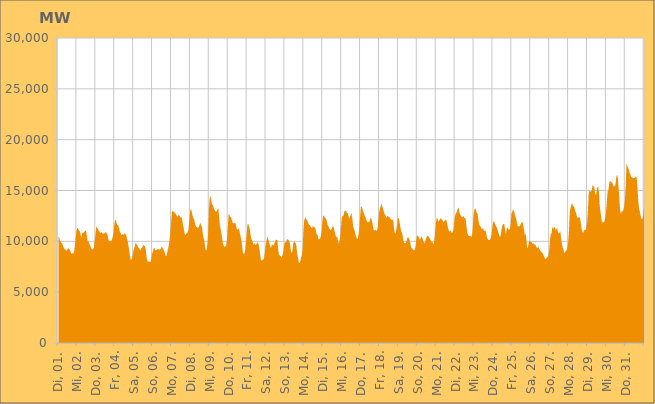
| Category | Series 0 |
|---|---|
|  Di, 01.  | 10445.555 |
|  Di, 01.  | 10419.191 |
|  Di, 01.  | 10097.247 |
|  Di, 01.  | 9958.587 |
|  Di, 01.  | 9844.854 |
|  Di, 01.  | 9770.898 |
|  Di, 01.  | 9508.113 |
|  Di, 01.  | 9325.802 |
|  Di, 01.  | 9215.358 |
|  Di, 01.  | 9183.292 |
|  Di, 01.  | 9062.21 |
|  Di, 01.  | 9200.198 |
|  Di, 01.  | 9219.905 |
|  Di, 01.  | 9341.486 |
|  Di, 01.  | 9201.362 |
|  Di, 01.  | 9060.962 |
|  Di, 01.  | 8852.814 |
|  Mi, 02.  | 8771.152 |
|  Mi, 02.  | 8826.07 |
|  Mi, 02.  | 8798.517 |
|  Mi, 02.  | 9039.4 |
|  Mi, 02.  | 9613.556 |
|  Mi, 02.  | 10374.406 |
|  Mi, 02.  | 11110.4 |
|  Mi, 02.  | 11357.895 |
|  Mi, 02.  | 11228.03 |
|  Mi, 02.  | 11088.038 |
|  Mi, 02.  | 11022.126 |
|  Mi, 02.  | 10733.58 |
|  Mi, 02.  | 10320.139 |
|  Mi, 02.  | 10777.185 |
|  Mi, 02.  | 10840.873 |
|  Mi, 02.  | 10858.001 |
|  Mi, 02.  | 10942.536 |
|  Mi, 02.  | 11053.273 |
|  Mi, 02.  | 11038.08 |
|  Mi, 02.  | 10603.086 |
|  Mi, 02.  | 9985.079 |
|  Mi, 02.  | 10029.684 |
|  Mi, 02.  | 9805.997 |
|  Mi, 02.  | 9645.54 |
|  Do, 03.  | 9463.206 |
|  Do, 03.  | 9246.563 |
|  Do, 03.  | 9196.385 |
|  Do, 03.  | 9236.031 |
|  Do, 03.  | 9390.222 |
|  Do, 03.  | 10028.074 |
|  Do, 03.  | 10663.041 |
|  Do, 03.  | 11423.543 |
|  Do, 03.  | 11342.75 |
|  Do, 03.  | 11226.537 |
|  Do, 03.  | 11043.154 |
|  Do, 03.  | 10981.808 |
|  Do, 03.  | 10848.605 |
|  Do, 03.  | 10858.742 |
|  Do, 03.  | 10906.88 |
|  Do, 03.  | 10753.203 |
|  Do, 03.  | 10773.815 |
|  Do, 03.  | 10733.892 |
|  Do, 03.  | 10811.203 |
|  Do, 03.  | 10944.98 |
|  Do, 03.  | 10813.566 |
|  Do, 03.  | 10718.458 |
|  Do, 03.  | 10353.268 |
|  Do, 03.  | 10026.153 |
|  Fr, 04.  | 10005.673 |
|  Fr, 04.  | 10040.819 |
|  Fr, 04.  | 10026.183 |
|  Fr, 04.  | 10138.438 |
|  Fr, 04.  | 10494.255 |
|  Fr, 04.  | 10883.877 |
|  Fr, 04.  | 11672.149 |
|  Fr, 04.  | 12050.847 |
|  Fr, 04.  | 12126.928 |
|  Fr, 04.  | 11753.707 |
|  Fr, 04.  | 11578.634 |
|  Fr, 04.  | 11565.523 |
|  Fr, 04.  | 11278.002 |
|  Fr, 04.  | 10945.739 |
|  Fr, 04.  | 10810.986 |
|  Fr, 04.  | 10598.176 |
|  Fr, 04.  | 10696.293 |
|  Fr, 04.  | 10681.751 |
|  Fr, 04.  | 10632.904 |
|  Fr, 04.  | 10795.002 |
|  Fr, 04.  | 10748.967 |
|  Fr, 04.  | 10632.363 |
|  Fr, 04.  | 10275.996 |
|  Fr, 04.  | 9980.591 |
|  Sa, 05.  | 9514.506 |
|  Sa, 05.  | 9021.876 |
|  Sa, 05.  | 8442.661 |
|  Sa, 05.  | 8174.343 |
|  Sa, 05.  | 8248.017 |
|  Sa, 05.  | 8510.015 |
|  Sa, 05.  | 8963.122 |
|  Sa, 05.  | 9272.572 |
|  Sa, 05.  | 9511.825 |
|  Sa, 05.  | 9886.77 |
|  Sa, 05.  | 9743.409 |
|  Sa, 05.  | 9620.666 |
|  Sa, 05.  | 9459.004 |
|  Sa, 05.  | 9334.704 |
|  Sa, 05.  | 9241.436 |
|  Sa, 05.  | 9075.775 |
|  Sa, 05.  | 9298.42 |
|  Sa, 05.  | 9354.086 |
|  Sa, 05.  | 9531.195 |
|  Sa, 05.  | 9655.398 |
|  Sa, 05.  | 9579.519 |
|  Sa, 05.  | 9476.483 |
|  Sa, 05.  | 9142.633 |
|  Sa, 05.  | 8419.96 |
|  So, 06.  | 7963.99 |
|  So, 06.  | 8060.899 |
|  So, 06.  | 7995.862 |
|  So, 06.  | 7970.158 |
|  So, 06.  | 7950.514 |
|  So, 06.  | 8342.362 |
|  So, 06.  | 8798.902 |
|  So, 06.  | 9030.661 |
|  So, 06.  | 9360.931 |
|  So, 06.  | 9336.352 |
|  So, 06.  | 9083.783 |
|  So, 06.  | 9141.129 |
|  So, 06.  | 9172.689 |
|  So, 06.  | 9251.171 |
|  So, 06.  | 9201.761 |
|  So, 06.  | 9203.3 |
|  So, 06.  | 9191.451 |
|  So, 06.  | 9278.999 |
|  So, 06.  | 9478.748 |
|  So, 06.  | 9387.526 |
|  So, 06.  | 9182.743 |
|  So, 06.  | 9090.256 |
|  So, 06.  | 8907.548 |
|  So, 06.  | 8584.94 |
|  Mo, 07.  | 8533.166 |
|  Mo, 07.  | 8889.502 |
|  Mo, 07.  | 9207.967 |
|  Mo, 07.  | 9571.606 |
|  Mo, 07.  | 10072.7 |
|  Mo, 07.  | 10750.087 |
|  Mo, 07.  | 11796.692 |
|  Mo, 07.  | 12857.751 |
|  Mo, 07.  | 12974.46 |
|  Mo, 07.  | 12963.93 |
|  Mo, 07.  | 12845.943 |
|  Mo, 07.  | 12816.254 |
|  Mo, 07.  | 12669.865 |
|  Mo, 07.  | 12559.615 |
|  Mo, 07.  | 12384.745 |
|  Mo, 07.  | 12533.211 |
|  Mo, 07.  | 12596.078 |
|  Mo, 07.  | 12482.191 |
|  Mo, 07.  | 12336.333 |
|  Mo, 07.  | 12390.351 |
|  Mo, 07.  | 12177.749 |
|  Mo, 07.  | 11707.152 |
|  Mo, 07.  | 11308.112 |
|  Mo, 07.  | 10806.887 |
|  Di, 08.  | 10593.928 |
|  Di, 08.  | 10710.138 |
|  Di, 08.  | 10775.645 |
|  Di, 08.  | 10894.459 |
|  Di, 08.  | 11131.542 |
|  Di, 08.  | 11830.049 |
|  Di, 08.  | 12882.979 |
|  Di, 08.  | 13219.369 |
|  Di, 08.  | 12991.055 |
|  Di, 08.  | 12621.662 |
|  Di, 08.  | 12329.587 |
|  Di, 08.  | 12209.612 |
|  Di, 08.  | 11885.83 |
|  Di, 08.  | 11594.195 |
|  Di, 08.  | 11405.807 |
|  Di, 08.  | 11399.331 |
|  Di, 08.  | 11309.371 |
|  Di, 08.  | 11386.213 |
|  Di, 08.  | 11590.257 |
|  Di, 08.  | 11841.671 |
|  Di, 08.  | 11642.917 |
|  Di, 08.  | 11434.284 |
|  Di, 08.  | 10893.425 |
|  Di, 08.  | 10397.928 |
|  Mi, 09.  | 10209.229 |
|  Mi, 09.  | 9545.648 |
|  Mi, 09.  | 9134.546 |
|  Mi, 09.  | 9136.57 |
|  Mi, 09.  | 9666.557 |
|  Mi, 09.  | 10764.98 |
|  Mi, 09.  | 13186.478 |
|  Mi, 09.  | 14120.65 |
|  Mi, 09.  | 14536.935 |
|  Mi, 09.  | 14032.447 |
|  Mi, 09.  | 13622.536 |
|  Mi, 09.  | 13591.791 |
|  Mi, 09.  | 13324.217 |
|  Mi, 09.  | 13116.796 |
|  Mi, 09.  | 12984.143 |
|  Mi, 09.  | 12901.335 |
|  Mi, 09.  | 12973.562 |
|  Mi, 09.  | 13162.781 |
|  Mi, 09.  | 13260.028 |
|  Mi, 09.  | 12387.385 |
|  Mi, 09.  | 11547.914 |
|  Mi, 09.  | 11176.04 |
|  Mi, 09.  | 10698.175 |
|  Mi, 09.  | 10263.756 |
|  Do, 10.  | 9676.162 |
|  Do, 10.  | 9559.6 |
|  Do, 10.  | 9451.004 |
|  Do, 10.  | 9528.954 |
|  Do, 10.  | 9558.523 |
|  Do, 10.  | 10216.979 |
|  Do, 10.  | 11376.004 |
|  Do, 10.  | 12633.762 |
|  Do, 10.  | 12635.733 |
|  Do, 10.  | 12412.581 |
|  Do, 10.  | 12391.956 |
|  Do, 10.  | 12134.114 |
|  Do, 10.  | 11845.056 |
|  Do, 10.  | 11744.92 |
|  Do, 10.  | 11823.355 |
|  Do, 10.  | 11747.993 |
|  Do, 10.  | 11775.761 |
|  Do, 10.  | 11350.507 |
|  Do, 10.  | 11090.281 |
|  Do, 10.  | 11195.756 |
|  Do, 10.  | 11279.297 |
|  Do, 10.  | 10911.545 |
|  Do, 10.  | 10578.303 |
|  Do, 10.  | 10220.414 |
|  Fr, 11.  | 9765.48 |
|  Fr, 11.  | 8951.537 |
|  Fr, 11.  | 8738.125 |
|  Fr, 11.  | 8785.089 |
|  Fr, 11.  | 9031.588 |
|  Fr, 11.  | 9795.053 |
|  Fr, 11.  | 10784.602 |
|  Fr, 11.  | 11665.44 |
|  Fr, 11.  | 11747.85 |
|  Fr, 11.  | 11435.452 |
|  Fr, 11.  | 11155.981 |
|  Fr, 11.  | 10534.767 |
|  Fr, 11.  | 10224.218 |
|  Fr, 11.  | 10048.105 |
|  Fr, 11.  | 9817.822 |
|  Fr, 11.  | 9626.965 |
|  Fr, 11.  | 9837.764 |
|  Fr, 11.  | 9648.15 |
|  Fr, 11.  | 9685.797 |
|  Fr, 11.  | 9805.668 |
|  Fr, 11.  | 9923.382 |
|  Fr, 11.  | 9727.097 |
|  Fr, 11.  | 9274.501 |
|  Fr, 11.  | 8784.315 |
|  Sa, 12.  | 8202.789 |
|  Sa, 12.  | 8080.126 |
|  Sa, 12.  | 8180.09 |
|  Sa, 12.  | 8163.664 |
|  Sa, 12.  | 8363.963 |
|  Sa, 12.  | 8933.969 |
|  Sa, 12.  | 9585.958 |
|  Sa, 12.  | 9989.784 |
|  Sa, 12.  | 10469.398 |
|  Sa, 12.  | 10318.208 |
|  Sa, 12.  | 10039.283 |
|  Sa, 12.  | 9745.637 |
|  Sa, 12.  | 9419.608 |
|  Sa, 12.  | 9394.065 |
|  Sa, 12.  | 9716.837 |
|  Sa, 12.  | 9653.962 |
|  Sa, 12.  | 9564.99 |
|  Sa, 12.  | 9756.094 |
|  Sa, 12.  | 9985.423 |
|  Sa, 12.  | 10155.288 |
|  Sa, 12.  | 10151.18 |
|  Sa, 12.  | 10068.063 |
|  Sa, 12.  | 9186.608 |
|  Sa, 12.  | 8673.23 |
|  So, 13.  | 8580.023 |
|  So, 13.  | 8529.103 |
|  So, 13.  | 8415.116 |
|  So, 13.  | 8560.362 |
|  So, 13.  | 8761.938 |
|  So, 13.  | 9279.886 |
|  So, 13.  | 9848.621 |
|  So, 13.  | 9911.59 |
|  So, 13.  | 9895.906 |
|  So, 13.  | 10171.776 |
|  So, 13.  | 10217.708 |
|  So, 13.  | 10130.983 |
|  So, 13.  | 9984.692 |
|  So, 13.  | 9746.831 |
|  So, 13.  | 9073.384 |
|  So, 13.  | 8825.252 |
|  So, 13.  | 9050.027 |
|  So, 13.  | 9723.191 |
|  So, 13.  | 9957.204 |
|  So, 13.  | 9931.586 |
|  So, 13.  | 9871.606 |
|  So, 13.  | 9575.368 |
|  So, 13.  | 8790.546 |
|  So, 13.  | 8435.192 |
|  Mo, 14.  | 7947.737 |
|  Mo, 14.  | 7822.809 |
|  Mo, 14.  | 8055.755 |
|  Mo, 14.  | 8420.154 |
|  Mo, 14.  | 8628.184 |
|  Mo, 14.  | 9361.329 |
|  Mo, 14.  | 11045.785 |
|  Mo, 14.  | 12063.801 |
|  Mo, 14.  | 12252.933 |
|  Mo, 14.  | 12348.455 |
|  Mo, 14.  | 12128.814 |
|  Mo, 14.  | 12022.373 |
|  Mo, 14.  | 11815.038 |
|  Mo, 14.  | 11618.956 |
|  Mo, 14.  | 11618.37 |
|  Mo, 14.  | 11463.142 |
|  Mo, 14.  | 11347.734 |
|  Mo, 14.  | 11315.684 |
|  Mo, 14.  | 11526.563 |
|  Mo, 14.  | 11392.12 |
|  Mo, 14.  | 11391.354 |
|  Mo, 14.  | 11328.287 |
|  Mo, 14.  | 10966.417 |
|  Mo, 14.  | 10632.166 |
|  Di, 15.  | 10642.651 |
|  Di, 15.  | 10163.73 |
|  Di, 15.  | 10227.957 |
|  Di, 15.  | 10275.395 |
|  Di, 15.  | 10450.979 |
|  Di, 15.  | 10898.814 |
|  Di, 15.  | 11913.05 |
|  Di, 15.  | 12521.305 |
|  Di, 15.  | 12495.394 |
|  Di, 15.  | 12354.789 |
|  Di, 15.  | 12274.967 |
|  Di, 15.  | 12151.17 |
|  Di, 15.  | 11863.305 |
|  Di, 15.  | 11534.137 |
|  Di, 15.  | 11435.996 |
|  Di, 15.  | 11240.502 |
|  Di, 15.  | 11111.29 |
|  Di, 15.  | 11133.704 |
|  Di, 15.  | 11273.614 |
|  Di, 15.  | 11456.774 |
|  Di, 15.  | 11429.287 |
|  Di, 15.  | 11182.272 |
|  Di, 15.  | 10801.253 |
|  Di, 15.  | 10515.676 |
|  Mi, 16.  | 10360.821 |
|  Mi, 16.  | 10478.339 |
|  Mi, 16.  | 10000.419 |
|  Mi, 16.  | 9772.426 |
|  Mi, 16.  | 10159.462 |
|  Mi, 16.  | 10763.949 |
|  Mi, 16.  | 11776.305 |
|  Mi, 16.  | 12505.466 |
|  Mi, 16.  | 12438.467 |
|  Mi, 16.  | 12579.94 |
|  Mi, 16.  | 12968.605 |
|  Mi, 16.  | 12956.017 |
|  Mi, 16.  | 13045.247 |
|  Mi, 16.  | 12796.004 |
|  Mi, 16.  | 12800.798 |
|  Mi, 16.  | 12499.161 |
|  Mi, 16.  | 12237.263 |
|  Mi, 16.  | 12357.345 |
|  Mi, 16.  | 12590.866 |
|  Mi, 16.  | 12788.217 |
|  Mi, 16.  | 12282.956 |
|  Mi, 16.  | 11565.071 |
|  Mi, 16.  | 11244.101 |
|  Mi, 16.  | 11050.836 |
|  Do, 17.  | 10728.593 |
|  Do, 17.  | 10408.176 |
|  Do, 17.  | 10259.666 |
|  Do, 17.  | 10250.485 |
|  Do, 17.  | 10718.293 |
|  Do, 17.  | 11361.653 |
|  Do, 17.  | 12504.733 |
|  Do, 17.  | 13497.029 |
|  Do, 17.  | 13377.784 |
|  Do, 17.  | 13158.784 |
|  Do, 17.  | 12899.266 |
|  Do, 17.  | 12690.479 |
|  Do, 17.  | 12450.276 |
|  Do, 17.  | 12325.686 |
|  Do, 17.  | 12050.218 |
|  Do, 17.  | 11889.208 |
|  Do, 17.  | 11865.422 |
|  Do, 17.  | 11911.695 |
|  Do, 17.  | 11970.007 |
|  Do, 17.  | 12256.806 |
|  Do, 17.  | 12277.804 |
|  Do, 17.  | 11995.462 |
|  Do, 17.  | 11564.019 |
|  Do, 17.  | 11095.498 |
|  Fr, 18.  | 11065.898 |
|  Fr, 18.  | 11091.945 |
|  Fr, 18.  | 11153.475 |
|  Fr, 18.  | 10997.17 |
|  Fr, 18.  | 11236.366 |
|  Fr, 18.  | 11953.484 |
|  Fr, 18.  | 12789.681 |
|  Fr, 18.  | 13236.253 |
|  Fr, 18.  | 13429.299 |
|  Fr, 18.  | 13733.035 |
|  Fr, 18.  | 13441.035 |
|  Fr, 18.  | 13220.919 |
|  Fr, 18.  | 12916.824 |
|  Fr, 18.  | 12675.31 |
|  Fr, 18.  | 12591.215 |
|  Fr, 18.  | 12328.804 |
|  Fr, 18.  | 12382.568 |
|  Fr, 18.  | 12539.702 |
|  Fr, 18.  | 12406.733 |
|  Fr, 18.  | 12397.016 |
|  Fr, 18.  | 12308.139 |
|  Fr, 18.  | 12164.783 |
|  Fr, 18.  | 12091.921 |
|  Fr, 18.  | 12154.313 |
|  Sa, 19.  | 12035.187 |
|  Sa, 19.  | 11284.065 |
|  Sa, 19.  | 10768.211 |
|  Sa, 19.  | 10791.193 |
|  Sa, 19.  | 11210.825 |
|  Sa, 19.  | 11740.285 |
|  Sa, 19.  | 12306.179 |
|  Sa, 19.  | 12279.634 |
|  Sa, 19.  | 11896.305 |
|  Sa, 19.  | 11401.208 |
|  Sa, 19.  | 11018.473 |
|  Sa, 19.  | 10869.456 |
|  Sa, 19.  | 10478.5 |
|  Sa, 19.  | 10044.587 |
|  Sa, 19.  | 9810.825 |
|  Sa, 19.  | 9806.027 |
|  Sa, 19.  | 9831.973 |
|  Sa, 19.  | 10064.115 |
|  Sa, 19.  | 10383.45 |
|  Sa, 19.  | 10403.461 |
|  Sa, 19.  | 10248.074 |
|  Sa, 19.  | 10105.261 |
|  Sa, 19.  | 9652.624 |
|  Sa, 19.  | 9356.055 |
|  So, 20.  | 9303.32 |
|  So, 20.  | 9180.399 |
|  So, 20.  | 9135.037 |
|  So, 20.  | 9127.316 |
|  So, 20.  | 9371.232 |
|  So, 20.  | 9959.435 |
|  So, 20.  | 10523.011 |
|  So, 20.  | 10577.56 |
|  So, 20.  | 10466.56 |
|  So, 20.  | 10260.148 |
|  So, 20.  | 10164.838 |
|  So, 20.  | 10325.182 |
|  So, 20.  | 10493.621 |
|  So, 20.  | 10293.738 |
|  So, 20.  | 10056.107 |
|  So, 20.  | 9855.894 |
|  So, 20.  | 9873.841 |
|  So, 20.  | 10063.356 |
|  So, 20.  | 10369.924 |
|  So, 20.  | 10521.187 |
|  So, 20.  | 10536.615 |
|  So, 20.  | 10456.546 |
|  So, 20.  | 10328.246 |
|  So, 20.  | 10143.8 |
|  Mo, 21.  | 10011.666 |
|  Mo, 21.  | 9893.44 |
|  Mo, 21.  | 9910.913 |
|  Mo, 21.  | 9668.669 |
|  Mo, 21.  | 10095.535 |
|  Mo, 21.  | 10769.497 |
|  Mo, 21.  | 11761.868 |
|  Mo, 21.  | 12284.517 |
|  Mo, 21.  | 12236.852 |
|  Mo, 21.  | 11920.027 |
|  Mo, 21.  | 12011.233 |
|  Mo, 21.  | 12153.097 |
|  Mo, 21.  | 12268.672 |
|  Mo, 21.  | 12196.331 |
|  Mo, 21.  | 12109.069 |
|  Mo, 21.  | 12002.846 |
|  Mo, 21.  | 11827.662 |
|  Mo, 21.  | 12064.755 |
|  Mo, 21.  | 12036.338 |
|  Mo, 21.  | 12154.097 |
|  Mo, 21.  | 11919.522 |
|  Mo, 21.  | 11495.748 |
|  Mo, 21.  | 11153.712 |
|  Mo, 21.  | 11011.814 |
|  Di, 22.  | 10927.694 |
|  Di, 22.  | 11087.254 |
|  Di, 22.  | 10787.142 |
|  Di, 22.  | 10849.77 |
|  Di, 22.  | 11015.282 |
|  Di, 22.  | 11541.772 |
|  Di, 22.  | 12342.467 |
|  Di, 22.  | 12708.593 |
|  Di, 22.  | 12788.289 |
|  Di, 22.  | 13016.881 |
|  Di, 22.  | 13219.567 |
|  Di, 22.  | 13320.729 |
|  Di, 22.  | 12826.194 |
|  Di, 22.  | 12636.355 |
|  Di, 22.  | 12479.778 |
|  Di, 22.  | 12407.461 |
|  Di, 22.  | 12385.713 |
|  Di, 22.  | 12491.537 |
|  Di, 22.  | 12273.156 |
|  Di, 22.  | 12347.537 |
|  Di, 22.  | 12111.47 |
|  Di, 22.  | 11423.491 |
|  Di, 22.  | 10829.238 |
|  Di, 22.  | 10628.855 |
|  Mi, 23.  | 10523.726 |
|  Mi, 23.  | 10534.459 |
|  Mi, 23.  | 10517.745 |
|  Mi, 23.  | 10429.743 |
|  Mi, 23.  | 10601.634 |
|  Mi, 23.  | 11463.616 |
|  Mi, 23.  | 12663.376 |
|  Mi, 23.  | 13126.949 |
|  Mi, 23.  | 13235.888 |
|  Mi, 23.  | 13088.566 |
|  Mi, 23.  | 12796.541 |
|  Mi, 23.  | 12727.798 |
|  Mi, 23.  | 12123.582 |
|  Mi, 23.  | 11689.898 |
|  Mi, 23.  | 11488.513 |
|  Mi, 23.  | 11417.448 |
|  Mi, 23.  | 11219.003 |
|  Mi, 23.  | 11207.265 |
|  Mi, 23.  | 11323.146 |
|  Mi, 23.  | 11054.485 |
|  Mi, 23.  | 11044.169 |
|  Mi, 23.  | 11063.559 |
|  Mi, 23.  | 10761.913 |
|  Mi, 23.  | 10355.758 |
|  Do, 24.  | 10187.074 |
|  Do, 24.  | 10126.453 |
|  Do, 24.  | 10136.698 |
|  Do, 24.  | 10218.452 |
|  Do, 24.  | 10329.878 |
|  Do, 24.  | 10819.89 |
|  Do, 24.  | 11549.059 |
|  Do, 24.  | 11952.524 |
|  Do, 24.  | 11958.352 |
|  Do, 24.  | 11753.57 |
|  Do, 24.  | 11578.57 |
|  Do, 24.  | 11425.115 |
|  Do, 24.  | 11257.934 |
|  Do, 24.  | 10958.585 |
|  Do, 24.  | 10718.369 |
|  Do, 24.  | 10459.319 |
|  Do, 24.  | 10484.216 |
|  Do, 24.  | 10982.194 |
|  Do, 24.  | 11434.64 |
|  Do, 24.  | 11631.723 |
|  Do, 24.  | 11715.382 |
|  Do, 24.  | 11672.318 |
|  Do, 24.  | 11080.718 |
|  Do, 24.  | 10747.021 |
|  Fr, 25.  | 11221.974 |
|  Fr, 25.  | 11397.574 |
|  Fr, 25.  | 11223.395 |
|  Fr, 25.  | 11110.584 |
|  Fr, 25.  | 11209.144 |
|  Fr, 25.  | 11725.683 |
|  Fr, 25.  | 12724.179 |
|  Fr, 25.  | 12896.566 |
|  Fr, 25.  | 13150.86 |
|  Fr, 25.  | 12988.454 |
|  Fr, 25.  | 12765.439 |
|  Fr, 25.  | 12428.88 |
|  Fr, 25.  | 12210.318 |
|  Fr, 25.  | 11809.845 |
|  Fr, 25.  | 11456.012 |
|  Fr, 25.  | 11490.761 |
|  Fr, 25.  | 11459.693 |
|  Fr, 25.  | 11555.167 |
|  Fr, 25.  | 11740.521 |
|  Fr, 25.  | 11892.366 |
|  Fr, 25.  | 11906.055 |
|  Fr, 25.  | 11568.186 |
|  Fr, 25.  | 11138.044 |
|  Fr, 25.  | 10570.963 |
|  Sa, 26.  | 10791.667 |
|  Sa, 26.  | 10166.303 |
|  Sa, 26.  | 9304.489 |
|  Sa, 26.  | 9386.822 |
|  Sa, 26.  | 9942.892 |
|  Sa, 26.  | 10050.747 |
|  Sa, 26.  | 9995.381 |
|  Sa, 26.  | 9937.273 |
|  Sa, 26.  | 9899.044 |
|  Sa, 26.  | 9715.98 |
|  Sa, 26.  | 9829.689 |
|  Sa, 26.  | 9662.298 |
|  Sa, 26.  | 9743.702 |
|  Sa, 26.  | 9544.389 |
|  Sa, 26.  | 9392.611 |
|  Sa, 26.  | 9331.339 |
|  Sa, 26.  | 9517.152 |
|  Sa, 26.  | 9261.048 |
|  Sa, 26.  | 9146.766 |
|  Sa, 26.  | 9035.378 |
|  Sa, 26.  | 8948.671 |
|  Sa, 26.  | 8863.496 |
|  Sa, 26.  | 8788.687 |
|  Sa, 26.  | 8544.133 |
|  So, 27.  | 8416.95 |
|  So, 27.  | 8239.664 |
|  So, 27.  | 8311.695 |
|  So, 27.  | 8386.877 |
|  So, 27.  | 8501.812 |
|  So, 27.  | 8623.294 |
|  So, 27.  | 9177.79 |
|  So, 27.  | 10184.528 |
|  So, 27.  | 10754.752 |
|  So, 27.  | 10788.692 |
|  So, 27.  | 11455.262 |
|  So, 27.  | 11271.161 |
|  So, 27.  | 11291.215 |
|  So, 27.  | 11459.786 |
|  So, 27.  | 11076.76 |
|  So, 27.  | 11247.458 |
|  So, 27.  | 11273.894 |
|  So, 27.  | 10938.644 |
|  So, 27.  | 10765.82 |
|  So, 27.  | 10832.832 |
|  So, 27.  | 11017.493 |
|  So, 27.  | 10266.119 |
|  So, 27.  | 9777.521 |
|  So, 27.  | 9391.521 |
|  So, 27.  | 9207.524 |
|  Mo, 28.  | 8832.92 |
|  Mo, 28.  | 8935.451 |
|  Mo, 28.  | 9065.124 |
|  Mo, 28.  | 9133.143 |
|  Mo, 28.  | 9321.682 |
|  Mo, 28.  | 9932.187 |
|  Mo, 28.  | 11031.761 |
|  Mo, 28.  | 12843.145 |
|  Mo, 28.  | 13317.198 |
|  Mo, 28.  | 13598.24 |
|  Mo, 28.  | 13762.918 |
|  Mo, 28.  | 13488.919 |
|  Mo, 28.  | 13428.484 |
|  Mo, 28.  | 13292.129 |
|  Mo, 28.  | 12963.346 |
|  Mo, 28.  | 12805.596 |
|  Mo, 28.  | 12441.868 |
|  Mo, 28.  | 12256.464 |
|  Mo, 28.  | 12372.374 |
|  Mo, 28.  | 12374.792 |
|  Mo, 28.  | 12336.433 |
|  Mo, 28.  | 11829.424 |
|  Mo, 28.  | 11242.725 |
|  Mo, 28.  | 10922.483 |
|  Di, 29.  | 10803.263 |
|  Di, 29.  | 11083.281 |
|  Di, 29.  | 11099.007 |
|  Di, 29.  | 11135.994 |
|  Di, 29.  | 11317.964 |
|  Di, 29.  | 11882.789 |
|  Di, 29.  | 12993.073 |
|  Di, 29.  | 14590.907 |
|  Di, 29.  | 15051.055 |
|  Di, 29.  | 14878.907 |
|  Di, 29.  | 14923.559 |
|  Di, 29.  | 15023.506 |
|  Di, 29.  | 15561.235 |
|  Di, 29.  | 15381.526 |
|  Di, 29.  | 15364.201 |
|  Di, 29.  | 14846.078 |
|  Di, 29.  | 14490.062 |
|  Di, 29.  | 14811.652 |
|  Di, 29.  | 15331.687 |
|  Di, 29.  | 15378.605 |
|  Di, 29.  | 14902.003 |
|  Di, 29.  | 13556.187 |
|  Di, 29.  | 12897.443 |
|  Di, 29.  | 12353.931 |
|  Mi, 30.  | 11766.818 |
|  Mi, 30.  | 11967.875 |
|  Mi, 30.  | 11860.5 |
|  Mi, 30.  | 11954.231 |
|  Mi, 30.  | 12253.487 |
|  Mi, 30.  | 12866.272 |
|  Mi, 30.  | 13838.968 |
|  Mi, 30.  | 14888.299 |
|  Mi, 30.  | 14994.401 |
|  Mi, 30.  | 15693.759 |
|  Mi, 30.  | 15935.983 |
|  Mi, 30.  | 15865 |
|  Mi, 30.  | 15829.546 |
|  Mi, 30.  | 15734.098 |
|  Mi, 30.  | 15543.088 |
|  Mi, 30.  | 15414.231 |
|  Mi, 30.  | 15401.12 |
|  Mi, 30.  | 15570.043 |
|  Mi, 30.  | 16284.703 |
|  Mi, 30.  | 16561.592 |
|  Mi, 30.  | 16260.07 |
|  Mi, 30.  | 15260.979 |
|  Mi, 30.  | 14056.776 |
|  Mi, 30.  | 12968.426 |
|  Do, 31.  | 12684.73 |
|  Do, 31.  | 13015.845 |
|  Do, 31.  | 12920.038 |
|  Do, 31.  | 13105.047 |
|  Do, 31.  | 13374.905 |
|  Do, 31.  | 14082.668 |
|  Do, 31.  | 15501.968 |
|  Do, 31.  | 17620.645 |
|  Do, 31.  | 17481.397 |
|  Do, 31.  | 17180.368 |
|  Do, 31.  | 17057.734 |
|  Do, 31.  | 16711.011 |
|  Do, 31.  | 16579.005 |
|  Do, 31.  | 16308.7 |
|  Do, 31.  | 16314.957 |
|  Do, 31.  | 16226.003 |
|  Do, 31.  | 16221.37 |
|  Do, 31.  | 16223.816 |
|  Do, 31.  | 16315.642 |
|  Do, 31.  | 16376.542 |
|  Do, 31.  | 16196.593 |
|  Do, 31.  | 15171.636 |
|  Do, 31.  | 13920.787 |
|  Do, 31.  | 13138.68 |
|  Fr, 01.  | 12938.362 |
|  Fr, 01.  | 12471.779 |
|  Fr, 01.  | 12155.314 |
|  Fr, 01.  | 12171.984 |
|  Fr, 01.  | 12405.2 |